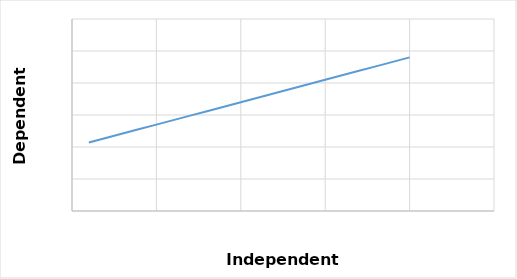
| Category | Dependent Y |
|---|---|
| 1.0 | 10.7 |
| 2.0 | 11.4 |
| 3.0 | 12.1 |
| 4.0 | 12.8 |
| 4.0 | 12.8 |
| 5.0 | 13.5 |
| 6.0 | 14.2 |
| 7.0 | 14.9 |
| 7.0 | 14.9 |
| 8.0 | 15.6 |
| 9.0 | 16.3 |
| 10.0 | 17 |
| 10.0 | 17 |
| 11.0 | 17.7 |
| 12.0 | 18.4 |
| 13.0 | 19.1 |
| 13.0 | 19.1 |
| 14.0 | 19.8 |
| 15.0 | 20.5 |
| 16.0 | 21.2 |
| 16.0 | 21.2 |
| 17.0 | 21.9 |
| 18.0 | 22.6 |
| 19.0 | 23.3 |
| 19.0 | 23.3 |
| 20.0 | 24 |